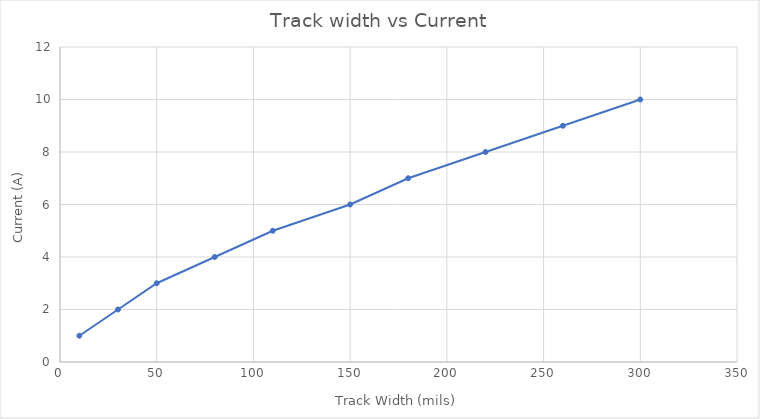
| Category | Series 0 |
|---|---|
| 10.0 | 1 |
| 30.0 | 2 |
| 50.0 | 3 |
| 80.0 | 4 |
| 110.0 | 5 |
| 150.0 | 6 |
| 180.0 | 7 |
| 220.0 | 8 |
| 260.0 | 9 |
| 300.0 | 10 |